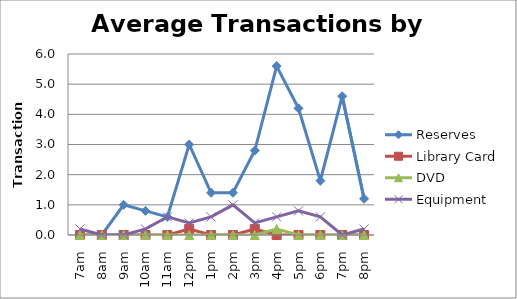
| Category | Reserves | Library Card | DVD | Equipment |
|---|---|---|---|---|
| 7am | 0 | 0 | 0 | 0.2 |
| 8am | 0 | 0 | 0 | 0 |
| 9am | 1 | 0 | 0 | 0 |
| 10am | 0.8 | 0 | 0 | 0.2 |
| 11am | 0.6 | 0 | 0 | 0.6 |
| 12pm | 3 | 0.2 | 0 | 0.4 |
| 1pm | 1.4 | 0 | 0 | 0.6 |
| 2pm | 1.4 | 0 | 0 | 1 |
| 3pm | 2.8 | 0.2 | 0 | 0.4 |
| 4pm | 5.6 | 0 | 0.2 | 0.6 |
| 5pm | 4.2 | 0 | 0 | 0.8 |
| 6pm | 1.8 | 0 | 0 | 0.6 |
| 7pm | 4.6 | 0 | 0 | 0 |
| 8pm | 1.2 | 0 | 0 | 0.2 |